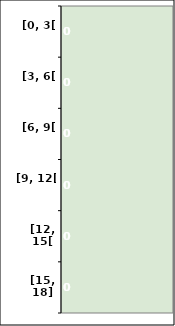
| Category | Series 0 |
|---|---|
| [0, 3[ | 0 |
| [3, 6[ | 0 |
| [6, 9[ | 0 |
| [9, 12[ | 0 |
| [12, 15[ | 0 |
| [15, 18] | 0 |